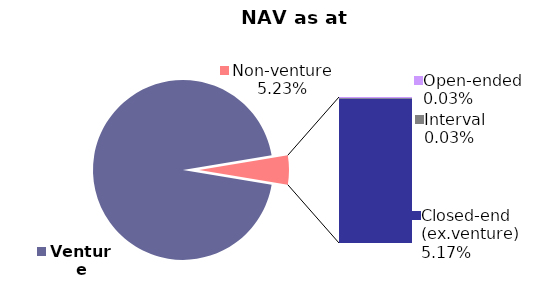
| Category | 31.12.2019 |
|---|---|
| Venture | 0.948 |
| Open-ended | 0 |
| Interval | 0 |
| Closed-end (ex.venture) | 0.052 |